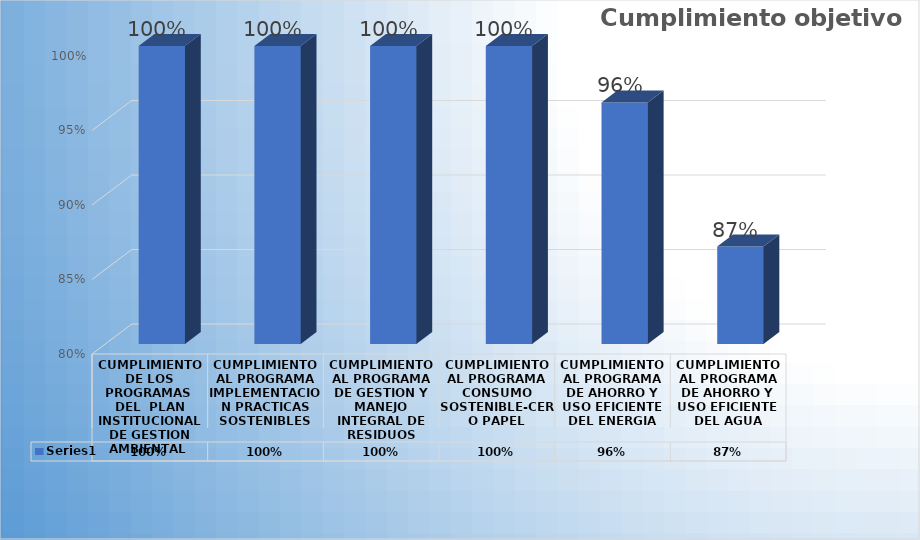
| Category | Series 0 |
|---|---|
| CUMPLIMIENTO DE LOS PROGRAMAS  DEL  PLAN INSTITUCIONAL DE GESTION AMBIENTAL  | 1 |
| CUMPLIMIENTO AL PROGRAMA IMPLEMENTACION PRACTICAS SOSTENIBLES | 1 |
| CUMPLIMIENTO AL PROGRAMA DE GESTION Y MANEJO INTEGRAL DE RESIDUOS | 1 |
| CUMPLIMIENTO AL PROGRAMA CONSUMO SOSTENIBLE-CERO PAPEL | 1 |
| CUMPLIMIENTO AL PROGRAMA DE AHORRO Y USO EFICIENTE DEL ENERGIA | 0.962 |
| CUMPLIMIENTO AL PROGRAMA DE AHORRO Y USO EFICIENTE DEL AGUA | 0.865 |